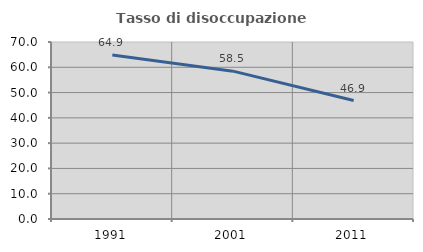
| Category | Tasso di disoccupazione giovanile  |
|---|---|
| 1991.0 | 64.892 |
| 2001.0 | 58.466 |
| 2011.0 | 46.85 |